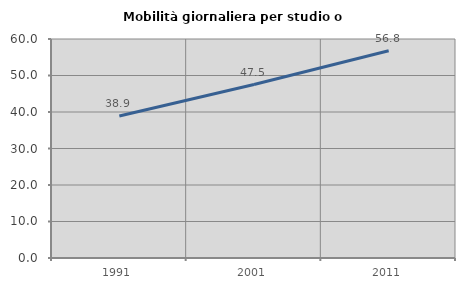
| Category | Mobilità giornaliera per studio o lavoro |
|---|---|
| 1991.0 | 38.914 |
| 2001.0 | 47.525 |
| 2011.0 | 56.784 |